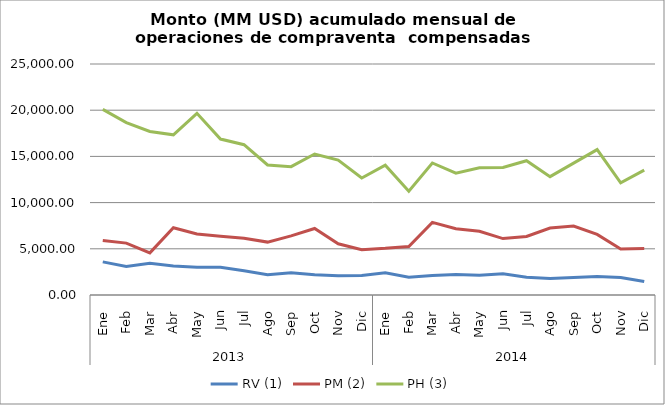
| Category | RV (1) | PM (2) | PH (3) |
|---|---|---|---|
| 0 | 3582.113 | 5901.651 | 20087.034 |
| 1 | 3086.223 | 5614.086 | 18662.914 |
| 2 | 3427.503 | 4559.027 | 17696.541 |
| 3 | 3146.302 | 7279.906 | 17332.385 |
| 4 | 2992.826 | 6596.857 | 19663.42 |
| 5 | 3012.804 | 6346.526 | 16878.408 |
| 6 | 2618.878 | 6139.885 | 16263.385 |
| 7 | 2182.732 | 5724.829 | 14069.305 |
| 8 | 2409.674 | 6399.577 | 13889.23 |
| 9 | 2180.079 | 7195.606 | 15254.774 |
| 10 | 2095.442 | 5541.836 | 14598.61 |
| 11 | 2104.88 | 4905.995 | 12657.524 |
| 12 | 2410.581 | 5047.1 | 14052.921 |
| 13 | 1913.3 | 5251.955 | 11240.27 |
| 14 | 2111.981 | 7861.413 | 14290.324 |
| 15 | 2223.473 | 7175.644 | 13176.799 |
| 16 | 2125.013 | 6892.343 | 13776.518 |
| 17 | 2301.328 | 6106.398 | 13805.87 |
| 18 | 1924.188 | 6332.088 | 14535.523 |
| 19 | 1793.449 | 7254.313 | 12809.829 |
| 20 | 1892.115 | 7460.432 | 14274.789 |
| 21 | 2010.501 | 6554.281 | 15737.718 |
| 22 | 1895.345 | 4974.789 | 12137.072 |
| 23 | 1450.26 | 5039.123 | 13514.7 |